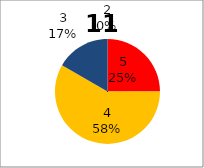
| Category | Series 0 |
|---|---|
| 5.0 | 3 |
| 4.0 | 7 |
| 3.0 | 2 |
| 2.0 | 0 |